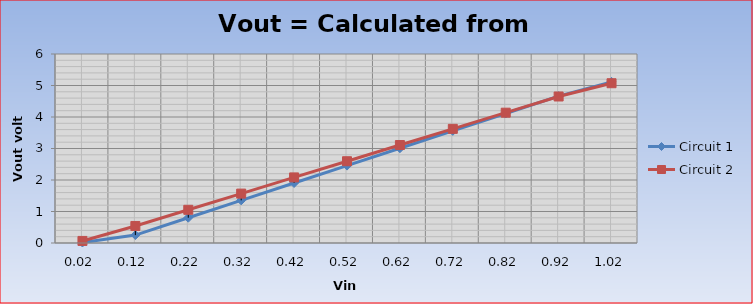
| Category | Circuit 1 | Circuit 2 |
|---|---|---|
| 0.02 | 0.016 | 0.066 |
| 0.12 | 0.251 | 0.541 |
| 0.22 | 0.802 | 1.054 |
| 0.32 | 1.354 | 1.568 |
| 0.42 | 1.905 | 2.082 |
| 0.52 | 2.457 | 2.596 |
| 0.62 | 3.008 | 3.11 |
| 0.72 | 3.56 | 3.624 |
| 0.82 | 4.111 | 4.137 |
| 0.92 | 4.662 | 4.651 |
| 1.02 | 5.115 | 5.072 |